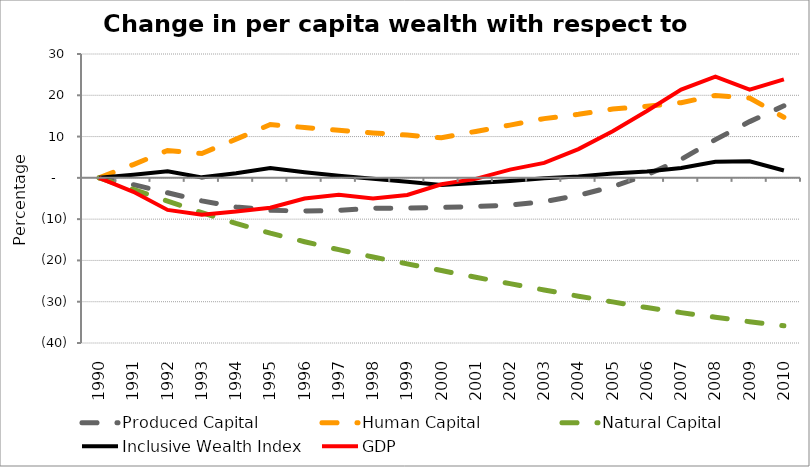
| Category | Produced Capital  | Human Capital | Natural Capital | Inclusive Wealth Index | GDP |
|---|---|---|---|---|---|
| 1990.0 | 0 | 0 | 0 | 0 | 0 |
| 1991.0 | -1.646 | 3.217 | -2.81 | 0.779 | -3.374 |
| 1992.0 | -3.617 | 6.641 | -5.646 | 1.612 | -7.766 |
| 1993.0 | -5.573 | 5.901 | -8.421 | 0.122 | -8.909 |
| 1994.0 | -7.037 | 9.372 | -11.027 | 1.129 | -8.126 |
| 1995.0 | -7.843 | 12.914 | -13.392 | 2.355 | -7.232 |
| 1996.0 | -8.05 | 12.21 | -15.467 | 1.374 | -5.011 |
| 1997.0 | -7.857 | 11.507 | -17.398 | 0.502 | -4.084 |
| 1998.0 | -7.372 | 10.893 | -19.168 | -0.227 | -5.012 |
| 1999.0 | -7.339 | 10.355 | -20.828 | -0.963 | -4.14 |
| 2000.0 | -7.172 | 9.714 | -22.457 | -1.726 | -1.547 |
| 2001.0 | -6.937 | 11.248 | -24.079 | -1.252 | -0.256 |
| 2002.0 | -6.583 | 12.782 | -25.627 | -0.738 | 1.996 |
| 2003.0 | -5.748 | 14.348 | -27.157 | -0.118 | 3.617 |
| 2004.0 | -4.242 | 15.39 | -28.659 | 0.332 | 6.97 |
| 2005.0 | -2.125 | 16.655 | -30.045 | 1.043 | 11.281 |
| 2006.0 | 0.716 | 17.342 | -31.42 | 1.559 | 16.209 |
| 2007.0 | 4.474 | 18.21 | -32.64 | 2.375 | 21.394 |
| 2008.0 | 9.269 | 19.958 | -33.763 | 3.892 | 24.52 |
| 2009.0 | 13.624 | 19.348 | -34.842 | 4.019 | 21.362 |
| 2010.0 | 17.456 | 14.669 | -35.843 | 1.789 | 23.86 |